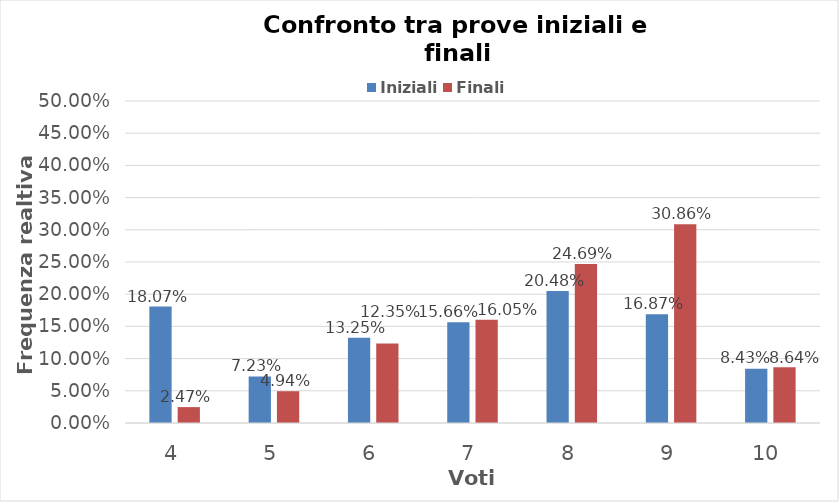
| Category | Iniziali | Finali |
|---|---|---|
| 4.0 | 0.181 | 0.025 |
| 5.0 | 0.072 | 0.049 |
| 6.0 | 0.133 | 0.123 |
| 7.0 | 0.157 | 0.16 |
| 8.0 | 0.205 | 0.247 |
| 9.0 | 0.169 | 0.309 |
| 10.0 | 0.084 | 0.086 |